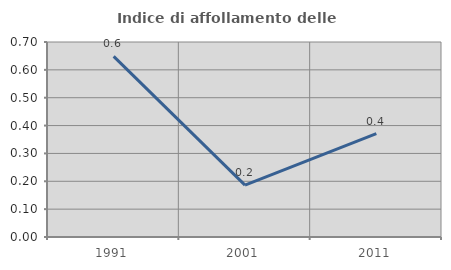
| Category | Indice di affollamento delle abitazioni  |
|---|---|
| 1991.0 | 0.648 |
| 2001.0 | 0.186 |
| 2011.0 | 0.371 |